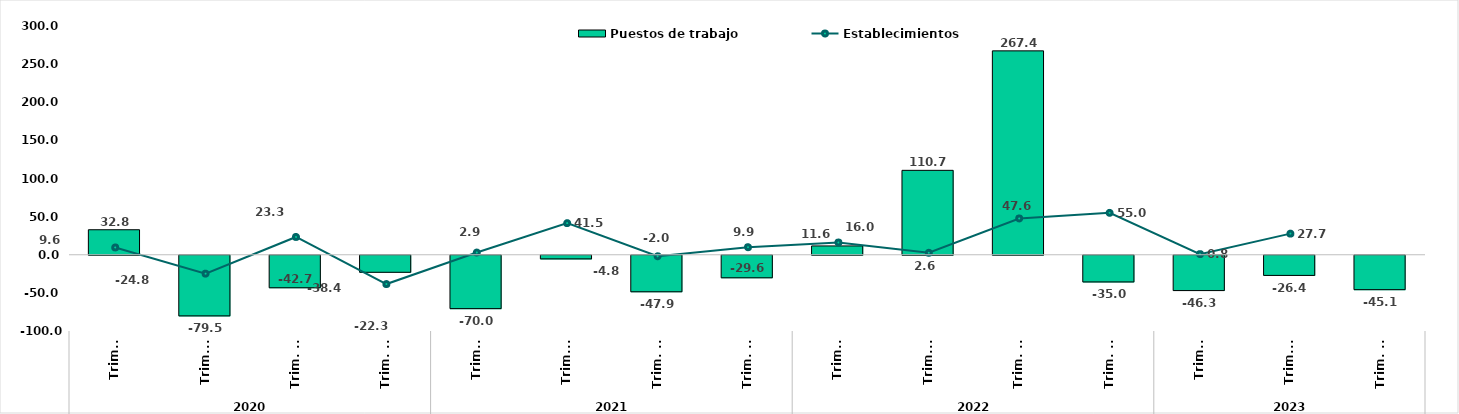
| Category | Puestos de trabajo |
|---|---|
| 0 | 32.791 |
| 1 | -79.526 |
| 2 | -42.652 |
| 3 | -22.34 |
| 4 | -70 |
| 5 | -4.762 |
| 6 | -47.911 |
| 7 | -29.589 |
| 8 | 11.565 |
| 9 | 110.714 |
| 10 | 267.38 |
| 11 | -35.019 |
| 12 | -46.341 |
| 13 | -26.441 |
| 14 | -45.124 |